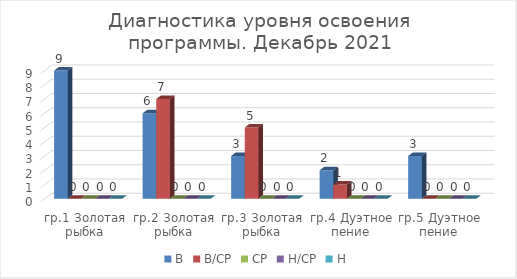
| Category | В | В/СР | СР | Н/СР | Н |
|---|---|---|---|---|---|
| гр.1 Золотая рыбка | 9 | 0 | 0 | 0 | 0 |
| гр.2 Золотая рыбка | 6 | 7 | 0 | 0 | 0 |
| гр.3 Золотая рыбка | 3 | 5 | 0 | 0 | 0 |
| гр.4 Дуэтное пение | 2 | 1 | 0 | 0 | 0 |
| гр.5 Дуэтное пение | 3 | 0 | 0 | 0 | 0 |